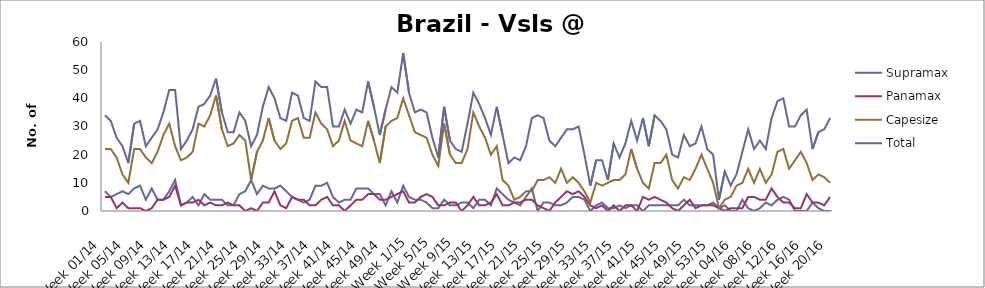
| Category | Supramax | Panamax | Capesize | Total |
|---|---|---|---|---|
| Week 01/14 | 7 | 5 | 22 | 34 |
| Week 02/14 | 5 | 5 | 22 | 32 |
| Week 03/14 | 6 | 1 | 19 | 26 |
| Week 04/14 | 7 | 3 | 13 | 23 |
| Week 05/14 | 6 | 1 | 10 | 17 |
| Week 06/14 | 8 | 1 | 22 | 31 |
| Week 07/14 | 9 | 1 | 22 | 32 |
| Week 08/14 | 4 | 0 | 19 | 23 |
| Week 09/14 | 8 | 1 | 17 | 26 |
| Week 10/14 | 4 | 4 | 21 | 29 |
| Week 11/14 | 4 | 4 | 27 | 35 |
| Week 12/14 | 7 | 5 | 31 | 43 |
| Week 13/14 | 11 | 9 | 23 | 43 |
| Week 14/14 | 2 | 2 | 18 | 22 |
| Week 15/14 | 3 | 3 | 19 | 25 |
| Week 16/14 | 5 | 3 | 21 | 29 |
| Week 17/14 | 2 | 4 | 31 | 37 |
| Week 18/14 | 6 | 2 | 30 | 38 |
| Week 19/14 | 4 | 3 | 34 | 41 |
| Week 20/14 | 4 | 2 | 41 | 47 |
| Week 21/14 | 4 | 2 | 29 | 35 |
| Week 22/14 | 2 | 3 | 23 | 28 |
| Week 23/14 | 2 | 2 | 24 | 28 |
| Week 24/14 | 6 | 2 | 27 | 35 |
| Week 25/14 | 7 | 0 | 25 | 32 |
| Week 26/14 | 11 | 1 | 11 | 23 |
| Week 27/14 | 6 | 0 | 21 | 27 |
| Week 28/14 | 9 | 3 | 25 | 37 |
| Week 29/14 | 8 | 3 | 33 | 44 |
| Week 30/14 | 8 | 7 | 25 | 40 |
| Week 31/14 | 9 | 2 | 22 | 33 |
| Week 32/14 | 7 | 1 | 24 | 32 |
| Week 33/14 | 5 | 5 | 32 | 42 |
| Week 34/14 | 4 | 4 | 33 | 41 |
| Week 35/14 | 3 | 4 | 26 | 33 |
| Week 36/14 | 4 | 2 | 26 | 32 |
| Week 37/14 | 9 | 2 | 35 | 46 |
| Week 38/14 | 9 | 4 | 31 | 44 |
| Week 39/14 | 10 | 5 | 29 | 44 |
| Week 40/14 | 5 | 2 | 23 | 30 |
| Week 41/14 | 3 | 2 | 25 | 30 |
| Week 42/14 | 4 | 0 | 32 | 36 |
| Week 43/14 | 4 | 2 | 25 | 31 |
| Week 44/14 | 8 | 4 | 24 | 36 |
| Week 45/14 | 8 | 4 | 23 | 35 |
| Week 46/14 | 8 | 6 | 32 | 46 |
| Week 47/14 | 6 | 6 | 25 | 37 |
| Week 48/14 | 6 | 4 | 17 | 27 |
| Week 49/14 | 2 | 4 | 30 | 36 |
| Week 50/14 | 7 | 5 | 32 | 44 |
| Week 51/14 | 3 | 6 | 33 | 42 |
| Week 52/14 | 9 | 7 | 40 | 56 |
| Week 1/15 | 5 | 3 | 34 | 42 |
| Week 2/15 | 4 | 3 | 28 | 35 |
| Week 3/15 | 4 | 5 | 27 | 36 |
| Week 4/15 | 3 | 6 | 26 | 35 |
| Week 5/15 | 1 | 5 | 20 | 26 |
| Week 6/15 | 1 | 2 | 16 | 19 |
| Week 7/15 | 4 | 2 | 31 | 37 |
| Week 8/15 | 2 | 3 | 20 | 25 |
| Week 9/15 | 2 | 3 | 17 | 22 |
| Week 10/15 | 3 | 0 | 17 | 21 |
| Week 11/15 | 3 | 2 | 22 | 31 |
| Week 12/15 | 1 | 5 | 35 | 42 |
| Week 13/15 | 4 | 2 | 30 | 38 |
| Week 14/15 | 4 | 2 | 26 | 33 |
| Week 15/15 | 2 | 3 | 20 | 27 |
| Week 16/15 | 8 | 6 | 23 | 37 |
| Week 17/15 | 6 | 2 | 11 | 27 |
| Week 18/15 | 4 | 2 | 9 | 17 |
| Week 19/15 | 3 | 3 | 4 | 19 |
| Week 20/15 | 2 | 3 | 5 | 18 |
| Week 21/15 | 5 | 4 | 7 | 23 |
| Week 22/15 | 8 | 4 | 7 | 33 |
| Week 23/15 | 0 | 2 | 11 | 34 |
| Week 24/15 | 3 | 1 | 11 | 33 |
| Week 25/15 | 3 | 0 | 12 | 25 |
| Week 26/15 | 2 | 3 | 10 | 23 |
| Week 27/15 | 2 | 5 | 15 | 26 |
| Week 28/15 | 3 | 7 | 10 | 29 |
| Week 29/15 | 5 | 6 | 12 | 29 |
| Week 30/15 | 5 | 7 | 10 | 30 |
| Week 31/15 | 4 | 5 | 7 | 20 |
| Week 32/15 | 0 | 2 | 3 | 9 |
| Week 33/15 | 2 | 1 | 10 | 18 |
| Week 34/15 | 3 | 2 | 9 | 18 |
| Week 35/15 | 1 | 0 | 10 | 11 |
| Week 36/15 | 1 | 2 | 11 | 24 |
| Week 37/15 | 2 | 0 | 11 | 19 |
| Week 38/15 | 1 | 2 | 13 | 24 |
| Week 39/15 | 2 | 2 | 22 | 32 |
| Week 40/15 | 2 | 0 | 15 | 25 |
| Week 41/15 | 0 | 5 | 10 | 33 |
| Week 42/15 | 2 | 4 | 8 | 23 |
| Week 43/15 | 2 | 5 | 17 | 34 |
| Week 44/15 | 2 | 4 | 17 | 32 |
| Week 45/15 | 2 | 3 | 20 | 29 |
| Week 46/15 | 2 | 1 | 11 | 20 |
| Week 47/15 | 2 | 0 | 8 | 19 |
| Week 48/15 | 4 | 2 | 12 | 27 |
| Week 49/15 | 2 | 4 | 11 | 23 |
| Week 50/15 | 2 | 1 | 15 | 24 |
| Week 51/15 | 2 | 2 | 20 | 30 |
| Week 52/15 | 2 | 2 | 15 | 22 |
| Week 53/15 | 3 | 2 | 10 | 20 |
| Week 01/16 | 1 | 1 | 1 | 4 |
| Week 02/16 | 2 | 0 | 4 | 14 |
| Week 03/16 | 0 | 1 | 5 | 9 |
| Week 04/16 | 0 | 1 | 9 | 13 |
| Week 05/16 | 4 | 1 | 10 | 21 |
| Week 06/16 | 1 | 5 | 15 | 29 |
| Week 07/16 | 0 | 5 | 10 | 22 |
| Week 08/16 | 1 | 4 | 15 | 25 |
| Week 09/16 | 3 | 4 | 10 | 22 |
| Week 10/16 | 2 | 8 | 13 | 33 |
| Week 11/16 | 4 | 5 | 21 | 39 |
| Week 12/16 | 5 | 3 | 22 | 40 |
| Week 13/16 | 4 | 3 | 15 | 30 |
| Week 14/16 | 0 | 1 | 18 | 30 |
| Week 15/16 | 0 | 1 | 21 | 34 |
| Week 16/16 | 0 | 6 | 17 | 36 |
| Week 17/16 | 3 | 3 | 11 | 22 |
| Week 18/16 | 1 | 3 | 13 | 28 |
| Week 19/16 | 0 | 2 | 12 | 29 |
| Week 20/16 | 0 | 5 | 10 | 33 |